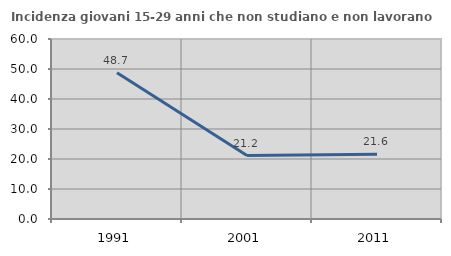
| Category | Incidenza giovani 15-29 anni che non studiano e non lavorano  |
|---|---|
| 1991.0 | 48.729 |
| 2001.0 | 21.154 |
| 2011.0 | 21.569 |